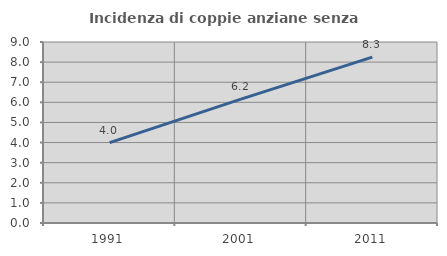
| Category | Incidenza di coppie anziane senza figli  |
|---|---|
| 1991.0 | 4 |
| 2001.0 | 6.161 |
| 2011.0 | 8.25 |